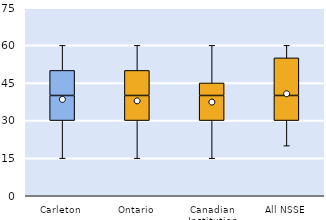
| Category | 25th | 50th | 75th |
|---|---|---|---|
| Carleton | 30 | 10 | 10 |
| Ontario | 30 | 10 | 10 |
| Canadian Institution | 30 | 10 | 5 |
| All NSSE | 30 | 10 | 15 |